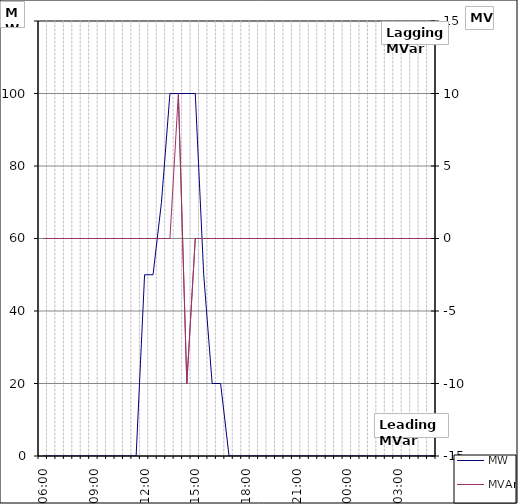
| Category | MW |
|---|---|
| 0.25 | 0 |
| 0.2708333333333333 | 0 |
| 0.291666666666667 | 0 |
| 0.3125 | 0 |
| 0.333333333333333 | 0 |
| 0.354166666666667 | 0 |
| 0.375 | 0 |
| 0.395833333333333 | 0 |
| 0.416666666666667 | 0 |
| 0.4375 | 0 |
| 0.458333333333333 | 0 |
| 0.479166666666666 | 0 |
| 0.5 | 50 |
| 0.520833333333333 | 50 |
| 0.541666666666666 | 70 |
| 0.5625 | 100 |
| 0.583333333333333 | 100 |
| 0.604166666666666 | 100 |
| 0.625 | 100 |
| 0.645833333333333 | 50 |
| 0.666666666666666 | 20 |
| 0.6875 | 20 |
| 0.708333333333333 | 0 |
| 0.729166666666666 | 0 |
| 0.75 | 0 |
| 0.770833333333333 | 0 |
| 0.791666666666666 | 0 |
| 0.8125 | 0 |
| 0.833333333333333 | 0 |
| 0.854166666666666 | 0 |
| 0.874999999999999 | 0 |
| 0.895833333333333 | 0 |
| 0.916666666666666 | 0 |
| 0.937499999999999 | 0 |
| 0.958333333333333 | 0 |
| 0.979166666666666 | 0 |
| 0.999999999999999 | 0 |
| 00:30 | 0 |
| 01:00 | 0 |
| 01:30 | 0 |
| 02:00 | 0 |
| 02:30 | 0 |
| 03:00 | 0 |
| 03:30 | 0 |
| 04:00 | 0 |
| 04:30 | 0 |
| 05:00 | 0 |